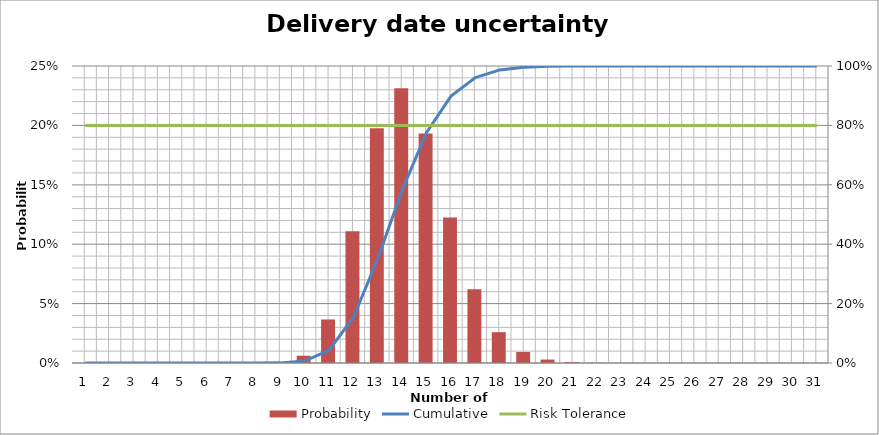
| Category | Probability |
|---|---|
| 1.0 | 0 |
| 2.0 | 0 |
| 3.0 | 0 |
| 4.0 | 0 |
| 5.0 | 0 |
| 6.0 | 0 |
| 7.0 | 0 |
| 8.0 | 0 |
| 9.0 | 0 |
| 10.0 | 0.006 |
| 11.0 | 0.037 |
| 12.0 | 0.111 |
| 13.0 | 0.198 |
| 14.0 | 0.231 |
| 15.0 | 0.193 |
| 16.0 | 0.123 |
| 17.0 | 0.062 |
| 18.0 | 0.026 |
| 19.0 | 0.009 |
| 20.0 | 0.003 |
| 21.0 | 0.001 |
| 22.0 | 0 |
| 23.0 | 0 |
| 24.0 | 0 |
| 25.0 | 0 |
| 26.0 | 0 |
| 27.0 | 0 |
| 28.0 | 0 |
| 29.0 | 0 |
| 30.0 | 0 |
| 31.0 | 0 |